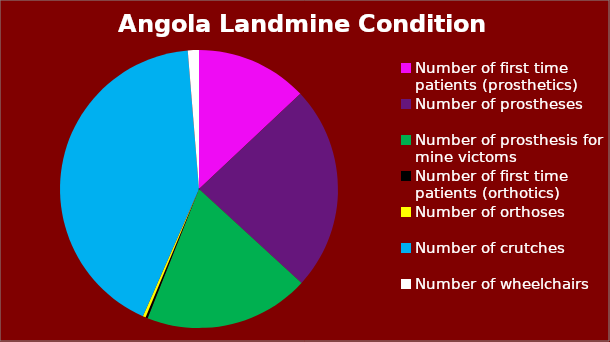
| Category | Series 0 |
|---|---|
| Number of first time patients (prosthetics) | 1067 |
| Number of prostheses | 1953 |
| Number of prosthesis for mine victoms | 1578 |
| Number of first time patients (orthotics) | 20 |
| Number of orthoses | 28 |
| Number of crutches | 3454 |
| Number of wheelchairs | 106 |